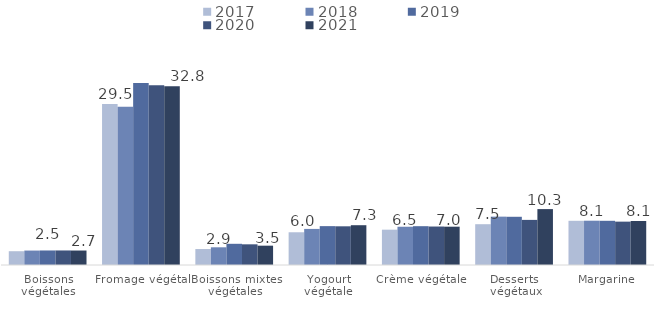
| Category | 2017 | 2018 | 2019 | 2020 | 2021 |
|---|---|---|---|---|---|
| Boissons végétales | 2.529 | 2.649 | 2.666 | 2.668 | 2.655 |
| Fromage végétal | 29.519 | 29.051 | 33.374 | 32.986 | 32.796 |
| Boissons mixtes végétales | 2.929 | 3.248 | 3.89 | 3.795 | 3.545 |
| Yogourt végétale | 6.005 | 6.621 | 7.132 | 7.101 | 7.3 |
| Crème végétale | 6.481 | 7.02 | 7.122 | 7.061 | 7.031 |
| Desserts  végétaux | 7.484 | 8.874 | 8.848 | 8.278 | 10.258 |
| Margarine | 8.11 | 8.128 | 8.11 | 7.956 | 8.075 |